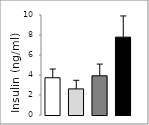
| Category | Series 0 |
|---|---|
| 0 | 3.724 |
| 1 | 2.61 |
| 2 | 3.921 |
| 3 | 7.787 |